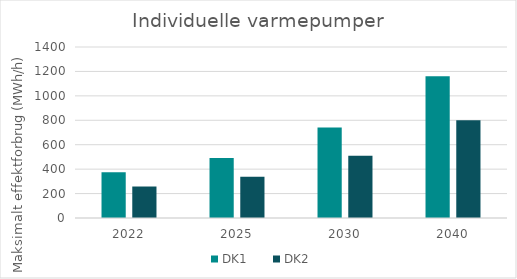
| Category | DK1 | DK2 |
|---|---|---|
| 2022.0 | 374.27 | 257.842 |
| 2025.0 | 490.857 | 338.161 |
| 2030.0 | 740.793 | 510.347 |
| 2040.0 | 1161.433 | 800.092 |